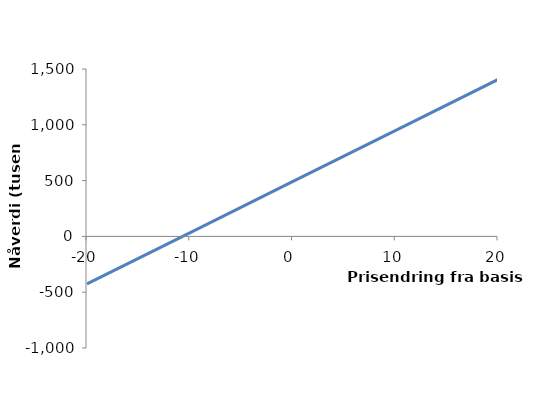
| Category | Endring fra basis |
|---|---|
| -20.0 | -425.653 |
| -10.0 | 32.318 |
| 0.0 | 490.289 |
| 10.0 | 948.259 |
| 20.0 | 1406.23 |